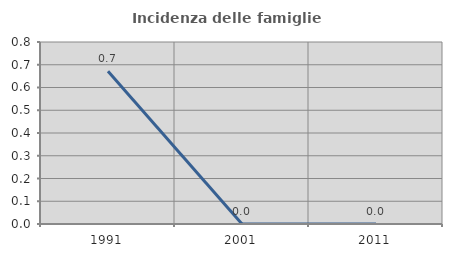
| Category | Incidenza delle famiglie numerose |
|---|---|
| 1991.0 | 0.671 |
| 2001.0 | 0 |
| 2011.0 | 0 |